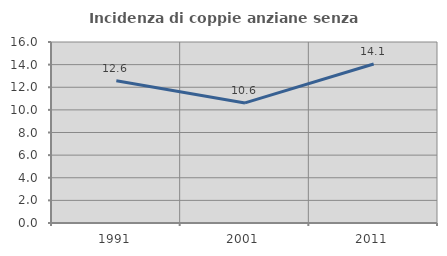
| Category | Incidenza di coppie anziane senza figli  |
|---|---|
| 1991.0 | 12.568 |
| 2001.0 | 10.615 |
| 2011.0 | 14.054 |